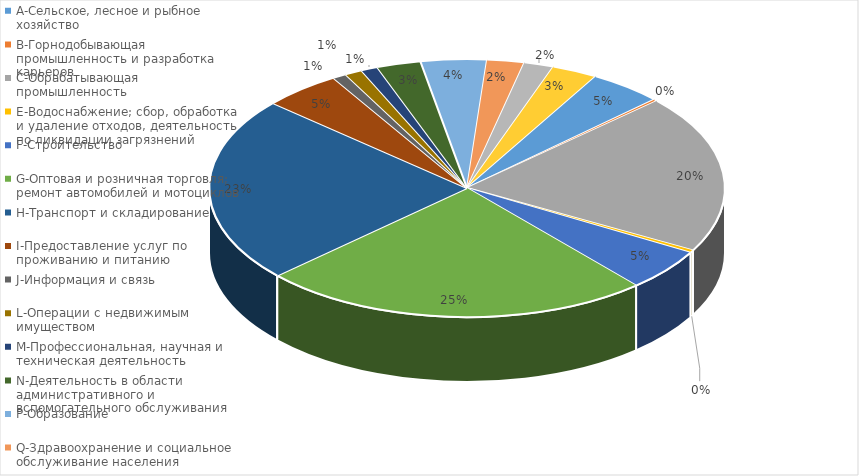
| Category |  Доля, %  |
|---|---|
| A-Сельское, лесное и рыбное хозяйство | 0.046 |
| B-Горнодобывающая промышленность и разработка карьеров | 0.002 |
| C-Обрабатывающая промышленность | 0.198 |
| E-Водоснабжение; сбор, обработка и удаление отходов, деятельность по ликвидации загрязнений | 0.003 |
| F-Строительство | 0.053 |
| G-Оптовая и розничная торговля; ремонт автомобилей и мотоциклов | 0.245 |
| H-Транспорт и складирование | 0.233 |
| I-Предоставление услуг по проживанию и питанию | 0.049 |
| J-Информация и связь | 0.009 |
| L-Операции с недвижимым имуществом | 0.011 |
| M-Профессиональная, научная и техническая деятельность | 0.011 |
| N-Деятельность в области административного и вспомогательного обслуживания | 0.028 |
| P-Образование | 0.041 |
| Q-Здравоохранение и социальное обслуживание населения | 0.023 |
| R-Искусство, развлечения и отдых | 0.019 |
| S-Предоставление прочих видов услуг | 0.029 |